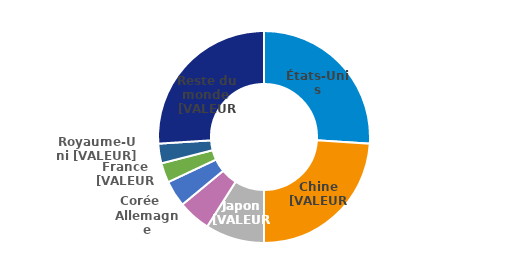
| Category | Series 0 |
|---|---|
| États-Unis | 0.26 |
| Chine | 0.24 |
| Japon | 0.09 |
| Allemagne | 0.05 |
| Corée du sud | 0.04 |
| France | 0.03 |
| Royaume-Uni | 0.03 |
| Reste du monde | 0.26 |